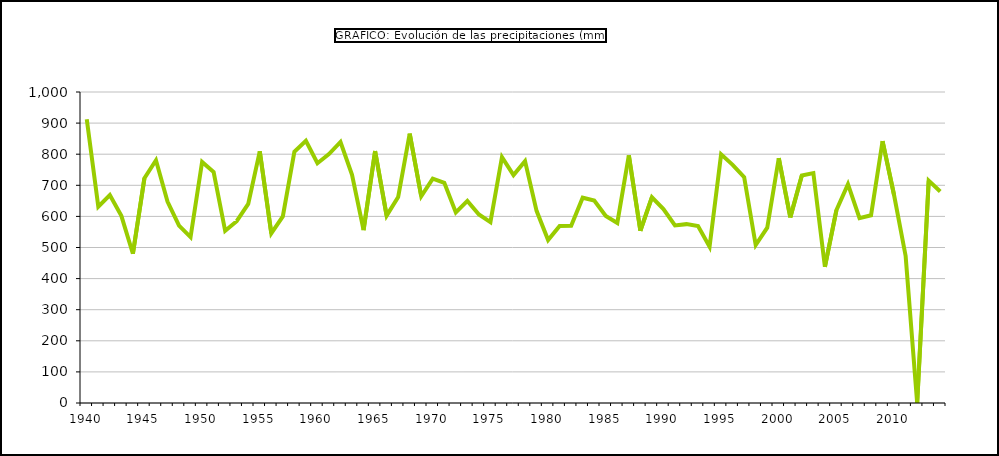
| Category | Precipitación (mm) |
|---|---|
| 1940 | 912.53 |
| 1941 | 631.39 |
| 1942 | 668.9 |
| 1943 | 601.59 |
| 1944 | 479.95 |
| 1945 | 723 |
| 1946 | 780.54 |
| 1947 | 647.81 |
| 1948 | 570.36 |
| 1949 | 533.43 |
| 1950 | 775.04 |
| 1951 | 742.54 |
| 1952 | 553.43 |
| 1953 | 584.56 |
| 1954 | 640.07 |
| 1955 | 809.21 |
| 1956 | 545.43 |
| 1957 | 599.89 |
| 1958 | 807.59 |
| 1959 | 842.8 |
| 1960 | 770.96 |
| 1961 | 800.26 |
| 1962 | 839.29 |
| 1963 | 733.72 |
| 1964 | 555.87 |
| 1965 | 810.05 |
| 1966 | 602.32 |
| 1967 | 662.08 |
| 1968 | 866.16 |
| 1969 | 664.8 |
| 1970 | 721.61 |
| 1971 | 708.1 |
| 1972 | 612.63 |
| 1973 | 649.82 |
| 1974 | 606.1 |
| 1975 | 581.29 |
| 1976 | 790.72 |
| 1977 | 732.89 |
| 1978 | 777.65 |
| 1979 | 617.83 |
| 1980 | 524.16 |
| 1981 | 569.46 |
| 1982 | 569.53 |
| 1983 | 660.16 |
| 1984 | 651.17 |
| 1985 | 601.34 |
| 1986 | 579.07 |
| 1987 | 796.27 |
| 1988 | 553.78 |
| 1989 | 661.42 |
| 1990 | 623.58 |
| 1991 | 570.95 |
| 1992 | 575.12 |
| 1993 | 569.11 |
| 1994 | 502.77 |
| 1995 | 799.4 |
| 1996 | 765.88 |
| 1997 | 726.37 |
| 1998 | 507.85 |
| 1999 | 563.59 |
| 2000 | 787.06 |
| 2001 | 596.85 |
| 2002 | 731.56 |
| 2003 | 739.28 |
| 2004 | 437.98 |
| 2005 | 620.05 |
| 2006 | 703.57 |
| 2007 | 594.59 |
| 2008 | 603.55 |
| 2009 | 841.9 |
| 2010 | 668 |
| 2011 | 472.67 |
| 2012 * | 0 |
| 2013 | 715 |
| 2014 | 680 |